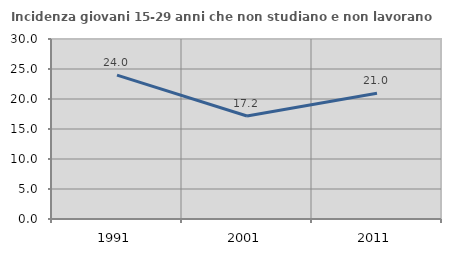
| Category | Incidenza giovani 15-29 anni che non studiano e non lavorano  |
|---|---|
| 1991.0 | 23.969 |
| 2001.0 | 17.161 |
| 2011.0 | 20.966 |